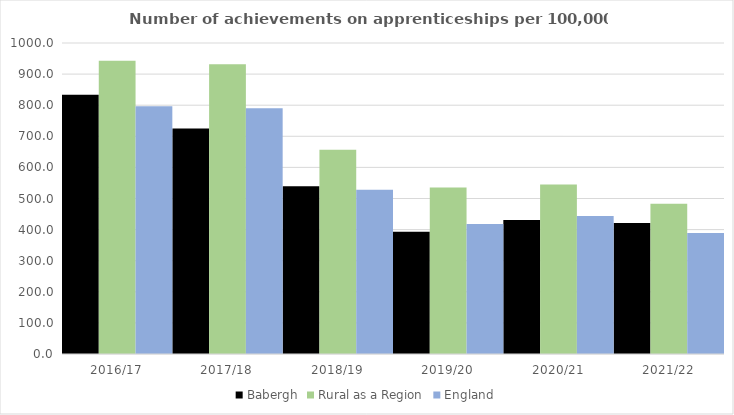
| Category | Babergh | Rural as a Region | England |
|---|---|---|---|
| 2016/17 | 834 | 942.594 | 797 |
| 2017/18 | 725 | 931.709 | 790 |
| 2018/19 | 539 | 656.44 | 528 |
| 2019/20 | 393 | 535.552 | 418 |
| 2020/21 | 431 | 545.333 | 444 |
| 2021/22 | 421 | 482.936 | 389 |